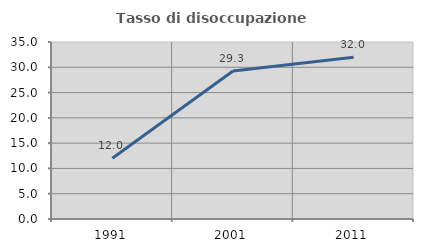
| Category | Tasso di disoccupazione giovanile  |
|---|---|
| 1991.0 | 12 |
| 2001.0 | 29.268 |
| 2011.0 | 32 |